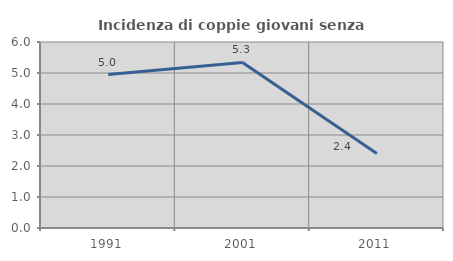
| Category | Incidenza di coppie giovani senza figli |
|---|---|
| 1991.0 | 4.95 |
| 2001.0 | 5.34 |
| 2011.0 | 2.404 |